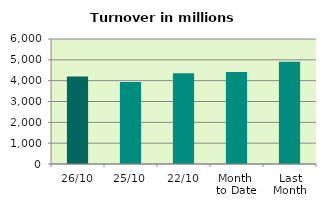
| Category | Series 0 |
|---|---|
| 26/10 | 4198.966 |
| 25/10 | 3939.255 |
| 22/10 | 4356.414 |
| Month 
to Date | 4415.595 |
| Last
Month | 4910.879 |